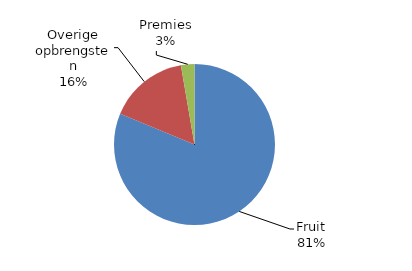
| Category | 2018* |
|---|---|
| Fruit | 283990.2 |
| Overige opbrengsten | 56102.081 |
| Premies | 9456.653 |